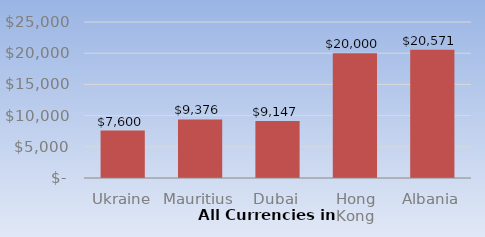
| Category | Series 0 |
|---|---|
| Ukraine | 7600 |
| Mauritius | 9376.251 |
| Dubai | 9146.566 |
| Hong Kong | 20000 |
| Albania | 20571 |